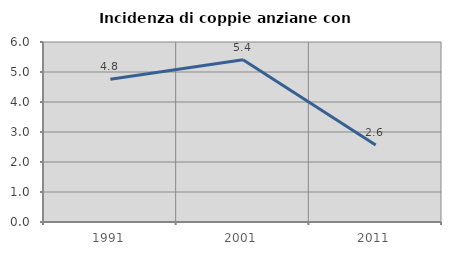
| Category | Incidenza di coppie anziane con figli |
|---|---|
| 1991.0 | 4.762 |
| 2001.0 | 5.405 |
| 2011.0 | 2.564 |